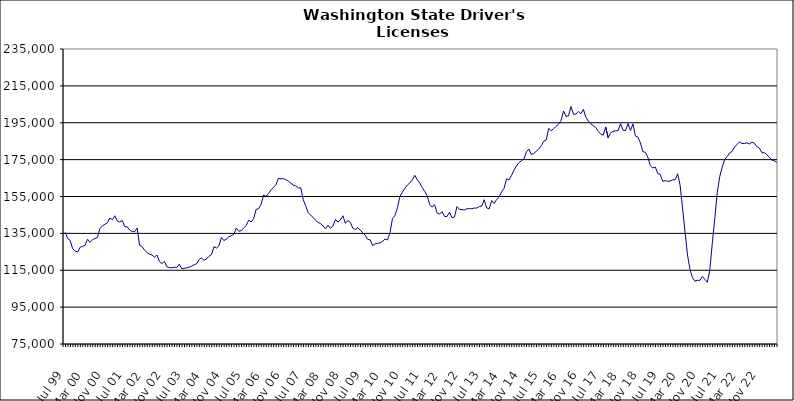
| Category | Series 0 |
|---|---|
| Jul 99 | 135560 |
| Aug 99 | 132182 |
| Sep 99 | 131104 |
| Oct 99 | 126694 |
| Nov 99 | 125425 |
| Dec 99 | 124927 |
| Jan 00 | 127499 |
| Feb 00 | 127927 |
| Mar 00 | 128547 |
| Apr 00 | 131834 |
| May 00 | 130120 |
| Jun 00 | 131595 |
| Jul 00 | 132236 |
| Aug 00 | 132819 |
| Sep 00 | 137711 |
| Oct 00 | 139063 |
| Nov 00 | 139952 |
| Dec 00 | 140732 |
| Jan 01 | 143338 |
| Feb 01 | 142359 |
| Mar 01 | 144523 |
| Apr 01 | 141758 |
| May 01 | 141135 |
| Jun 01 | 142064 |
| Jul 01 | 138646 |
| Aug 01 | 138530 |
| Sep 01 | 136784 |
| Oct 01 | 135996 |
| Nov 01 | 135917 |
| Dec 01 | 137940 |
| Jan 02 | 128531 |
| Feb 02 | 127848 |
| Mar 02 | 125876 |
| Apr 02 | 124595 |
| May 02 | 123660 |
| Jun 02 | 123282 |
| Jul 02 | 122089 |
| Aug 02 | 123279 |
| Sep 02 | 119727 |
| Oct 02 | 118588 |
| Nov 02 | 119854 |
| Dec 02 | 116851 |
| Jan 03 | 116407 |
| Feb 03 | 116382 |
| Mar 03 | 116648 |
| Apr 03 | 116471 |
| May 03 | 118231 |
| Jun 03 | 115831 |
| Jul 03 | 116082 |
| Aug 03 | 116341 |
| Sep 03 | 116653 |
| Oct 03 | 117212 |
| Nov 03 | 117962 |
| Dec 03 | 118542 |
| Jan 04 | 120817 |
| Feb 04 | 121617 |
| Mar 04 | 120369 |
| Apr 04 | 121200 |
| May 04 | 122609 |
| Jun 04 | 123484 |
| Jul 04 | 127844 |
| Aug 04 | 127025 |
| Sep 04 | 128273 |
| Oct 04 | 132853 |
| Nov 04 | 131106 |
| Dec 04 | 131935 |
| Jan 05 | 133205 |
| Feb 05 | 133736 |
| Mar 05 | 134528 |
| Apr 05 | 137889 |
| May 05 | 136130 |
| Jun 05 | 136523 |
| Jul 05 | 137997 |
| Aug 05 | 139294 |
| Sep 05 | 142140 |
| Oct 05 | 141192 |
| Nov 05 | 142937 |
| Dec 05 | 148013 |
| Jan 06 | 148341 |
| Feb 06 | 150744 |
| Mar 06 | 155794 |
| Apr 06 | 154984 |
| May 06 | 156651 |
| Jun 06 | 158638 |
| Jul 06 | 159911 |
| Aug 06 | 161445 |
| Sep 06 | 164852 |
| Oct 06 | 164570 |
| Nov 06 | 164679 |
| Dec 06 | 164127 |
| Jan 07 | 163271 |
| Feb 07 | 162273 |
| Mar 07 | 161140 |
| Apr 07 | 160860 |
| May 07 | 159633 |
| Jun 07 | 159724 |
| Jul 07 | 153303 |
| Aug 07 | 149939 |
| Sep 07 | 146172 |
| Oct 07 | 144876 |
| Nov 07 | 143613 |
| Dec 07 | 142022 |
| Jan 08 | 140909 |
| Feb 08 | 140368 |
| Mar 08 | 138998 |
| Apr 08 | 137471 |
| May 08 | 139453 |
| Jun 08 | 137680 |
| Jul 08 | 139120 |
| Aug 08 | 142612 |
| Sep-08 | 141071 |
| Oct 08 | 142313 |
| Nov 08 | 144556 |
| Dec 08 | 140394 |
| Jan 09 | 141903 |
| Feb 09 | 141036 |
| Mar 09 | 137751 |
| Apr 09 | 137060 |
| May 09 | 138101 |
| Jun 09 | 136739 |
| Jul 09 | 135317 |
| Aug 09 | 134020 |
| Sep 09 | 131756 |
| Oct 09 | 131488 |
| Nov 09 | 128370 |
| Dec 09 | 129323 |
| Jan 10 | 129531 |
| Feb 10 | 129848 |
| Mar 10 | 130654 |
| Apr 10 | 131929 |
| May 10 | 131429 |
| Jun 10 | 135357 |
| Jul 10 | 143032 |
| Aug 10 | 144686 |
| Sep 10 | 148856 |
| Oct 10 | 155042 |
| Nov 10 | 157328 |
| Dec 10 | 159501 |
| Jan 11 | 161221 |
| Feb 11 | 162312 |
| Mar 11 | 163996 |
| Apr 11 | 166495 |
| May 11 | 164040 |
| Jun 11 | 162324 |
| Jul 11 | 159862 |
| Aug 11 | 157738 |
| Sep 11 | 155430 |
| Oct 11 | 150762 |
| Nov 11 | 149255 |
| Dec 11 | 150533 |
| Jan 12 | 146068 |
| Feb 12 | 145446 |
| Mar 12 | 146788 |
| Apr 12 | 144110 |
| May 12 | 144162 |
| Jun 12 | 146482 |
| Jul 12 | 143445 |
| Aug 12 | 143950 |
| Sep 12 | 149520 |
| Oct 12 | 148033 |
| Nov 12 | 147926 |
| Dec 12 | 147674 |
| Jan 13 | 148360 |
| Feb-13 | 148388 |
| Mar-13 | 148414 |
| Apr 13 | 148749 |
| May 13 | 148735 |
| Jun-13 | 149521 |
| Jul 13 | 149837 |
| Aug 13 | 153252 |
| Sep 13 | 148803 |
| Oct 13 | 148315 |
| Nov 13 | 152804 |
| Dec 13 | 151209 |
| Jan 14 | 153357 |
| Feb-14 | 154608 |
| Mar 14 | 157479 |
| Apr 14 | 159441 |
| May 14 | 164591 |
| Jun 14 | 163995 |
| Jul-14 | 166411 |
| Aug-14 | 169272 |
| Sep 14 | 171565 |
| Oct 14 | 173335 |
| Nov 14 | 174406 |
| Dec 14 | 175302 |
| Jan 15 | 179204 |
| Feb 15 | 180737 |
| Mar 15 | 177810 |
| Apr-15 | 178331 |
| May 15 | 179601 |
| Jun-15 | 180729 |
| Jul 15 | 182540 |
| Aug 15 | 184924 |
| Sep 15 | 185620 |
| Oct 15 | 192002 |
| Nov 15 | 190681 |
| Dec 15 | 191795 |
| Jan 16 | 193132 |
| Feb 16 | 194206 |
| Mar 16 | 196319 |
| Apr 16 | 201373 |
| May 16 | 198500 |
| Jun 16 | 198743 |
| Jul 16 | 203841 |
| Aug 16 | 199630 |
| Sep 16 | 199655 |
| Oct 16 | 201181 |
| Nov 16 | 199888 |
| Dec 16 | 202304 |
| Jan 17 | 197977 |
| Feb 17 | 195889 |
| Mar 17 | 194438 |
| Apr 17 | 193335 |
| May 17 | 192430 |
| Jun 17 | 190298 |
| Jul 17 | 188832 |
| Aug 17 | 188264 |
| Sep 17 | 192738 |
| Oct 17 | 186856 |
| Nov 17 | 189537 |
| Dec 17 | 190341 |
| Jan 18 | 190670 |
| Feb 18 | 190645 |
| Mar 18 | 194476 |
| Apr 18 | 190971 |
| May 18 | 190707 |
| Jun 18 | 194516 |
| Jul 18 | 190783 |
| Aug 18 | 194390 |
| Sep 18 | 187831 |
| Oct 18 | 187188 |
| Nov 18 | 184054 |
| Dec 18 | 179347 |
| Jan 19 | 178958 |
| Feb 19 | 176289 |
| Mar 19 | 171747 |
| Apr 19 | 170532 |
| May 19 | 170967 |
| Jun 19 | 167444 |
| Jul 19 | 167059 |
| Aug 19 | 163194 |
| Sep 19 | 163599 |
| Oct 19 | 163212 |
| Nov 19 | 163388 |
| Dec 19 | 164024 |
| Jan 20 | 164114 |
| Feb 20 | 167320 |
| Mar 20 | 161221 |
| Apr 20 | 148866 |
| May 20 | 135821 |
| Jun 20 | 123252 |
| Jul 20 | 115526 |
| Aug 20 | 110940 |
| Sep 20 | 109099 |
| Oct 20 | 109566 |
| Nov 20 | 109488 |
| Dec 20 | 111658 |
| Jan 21 | 110070 |
| Feb 21 | 108491 |
| Mar 21 | 115176 |
| Apr 21 | 129726 |
| May 21 | 143052 |
| Jun 21 | 157253 |
| Jul 21 | 165832 |
| Aug 21 | 170937 |
| Sep 21 | 175042 |
| Oct 21 | 176696 |
| Nov 21 | 178677 |
| Dec 21 | 179501 |
| Jan 22 | 181825 |
| Feb 22 | 183258 |
| Mar 22 | 184618 |
| Apr 22 | 183710 |
| May 22 | 183784 |
| Jun 22 | 184101 |
| Jul 22 | 183443 |
| Aug 22 | 184475 |
| Sep 22 | 183902 |
| Oct 22 | 181994 |
| Nov 22 | 181207 |
| Dec 22 | 178793 |
| Jan 23 | 178782 |
| Feb 23 | 177647 |
| Mar 23 | 176386 |
| Apr 23 | 174729 |
| May 23 | 174390 |
| Jun 23 | 173391 |